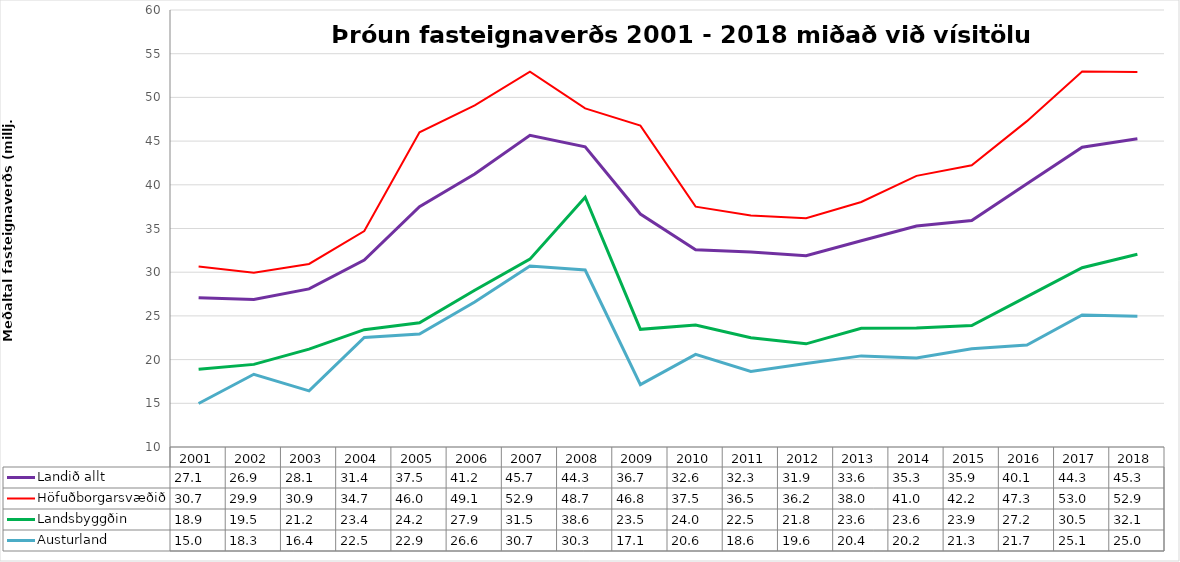
| Category | Landið allt | Höfuðborgarsvæðið | Landsbyggðin | Austurland |
|---|---|---|---|---|
| 2001.0 | 27.086 | 30.656 | 18.907 | 14.975 |
| 2002.0 | 26.867 | 29.935 | 19.452 | 18.322 |
| 2003.0 | 28.089 | 30.948 | 21.192 | 16.419 |
| 2004.0 | 31.383 | 34.707 | 23.426 | 22.531 |
| 2005.0 | 37.486 | 46.014 | 24.223 | 22.929 |
| 2006.0 | 41.241 | 49.086 | 27.928 | 26.593 |
| 2007.0 | 45.663 | 52.938 | 31.494 | 30.72 |
| 2008.0 | 44.34 | 48.748 | 38.571 | 30.254 |
| 2009.0 | 36.655 | 46.768 | 23.462 | 17.138 |
| 2010.0 | 32.575 | 37.496 | 23.952 | 20.604 |
| 2011.0 | 32.305 | 36.476 | 22.499 | 18.644 |
| 2012.0 | 31.877 | 36.174 | 21.802 | 19.555 |
| 2013.0 | 33.592 | 38.037 | 23.594 | 20.425 |
| 2014.0 | 35.279 | 41.021 | 23.606 | 20.192 |
| 2015.0 | 35.903 | 42.231 | 23.902 | 21.251 |
| 2016.0 | 40.132 | 47.285 | 27.201 | 21.661 |
| 2017.0 | 44.3 | 52.951 | 30.512 | 25.107 |
| 2018.0 | 45.263 | 52.895 | 32.058 | 24.959 |